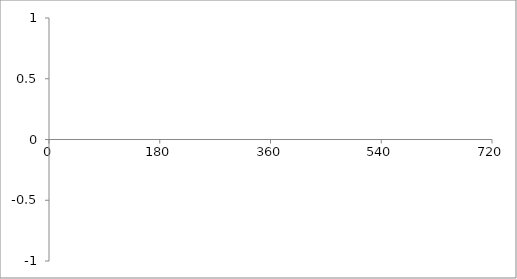
| Category | Series 0 |
|---|---|
| 0.0 | 0 |
| 0.0 | 0 |
| 0.0 | 0 |
| 0.0 | 0 |
| 0.0 | 0 |
| 0.0 | 0 |
| 0.0 | 0 |
| 0.0 | 0 |
| 0.0 | 0 |
| 0.0 | 0 |
| 0.0 | 0 |
| 0.0 | 0 |
| 0.0 | 0 |
| 0.0 | 0 |
| 0.0 | 0 |
| 0.0 | 0 |
| 0.0 | 0 |
| 0.0 | 0 |
| 0.0 | 0 |
| 0.0 | 0 |
| 0.0 | 0 |
| 0.0 | 0 |
| 0.0 | 0 |
| 0.0 | 0 |
| 0.0 | 0 |
| 0.0 | 0 |
| 0.0 | 0 |
| 0.0 | 0 |
| 0.0 | 0 |
| 0.0 | 0 |
| 0.0 | 0 |
| 0.0 | 0 |
| 0.0 | 0 |
| 0.0 | 0 |
| 0.0 | 0 |
| 0.0 | 0 |
| 0.0 | 0 |
| 0.0 | 0 |
| 0.0 | 0 |
| 0.0 | 0 |
| 0.0 | 0 |
| 0.0 | 0 |
| 0.0 | 0 |
| 0.0 | 0 |
| 0.0 | 0 |
| 0.0 | 0 |
| 0.0 | 0 |
| 0.0 | 0 |
| 0.0 | 0 |
| 0.0 | 0 |
| 0.0 | 0 |
| 0.0 | 0 |
| 0.0 | 0 |
| 0.0 | 0 |
| 0.0 | 0 |
| 0.0 | 0 |
| 0.0 | 0 |
| 0.0 | 0 |
| 0.0 | 0 |
| 0.0 | 0 |
| 0.0 | 0 |
| 0.0 | 0 |
| 0.0 | 0 |
| 0.0 | 0 |
| 0.0 | 0 |
| 0.0 | 0 |
| 0.0 | 0 |
| 0.0 | 0 |
| 0.0 | 0 |
| 0.0 | 0 |
| 0.0 | 0 |
| 0.0 | 0 |
| 0.0 | 0 |
| 0.0 | 0 |
| 0.0 | 0 |
| 0.0 | 0 |
| 0.0 | 0 |
| 0.0 | 0 |
| 0.0 | 0 |
| 0.0 | 0 |
| 0.0 | 0 |
| 0.0 | 0 |
| 0.0 | 0 |
| 0.0 | 0 |
| 0.0 | 0 |
| 0.0 | 0 |
| 0.0 | 0 |
| 0.0 | 0 |
| 0.0 | 0 |
| 0.0 | 0 |
| 0.0 | 0 |
| 0.0 | 0 |
| 0.0 | 0 |
| 0.0 | 0 |
| 0.0 | 0 |
| 0.0 | 0 |
| 0.0 | 0 |
| 0.0 | 0 |
| 0.0 | 0 |
| 0.0 | 0 |
| 0.0 | 0 |
| 0.0 | 0 |
| 0.0 | 0 |
| 0.0 | 0 |
| 0.0 | 0 |
| 0.0 | 0 |
| 0.0 | 0 |
| 0.0 | 0 |
| 0.0 | 0 |
| 0.0 | 0 |
| 0.0 | 0 |
| 0.0 | 0 |
| 0.0 | 0 |
| 0.0 | 0 |
| 0.0 | 0 |
| 0.0 | 0 |
| 0.0 | 0 |
| 0.0 | 0 |
| 0.0 | 0 |
| 0.0 | 0 |
| 0.0 | 0 |
| 0.0 | 0 |
| 0.0 | 0 |
| 0.0 | 0 |
| 0.0 | 0 |
| 0.0 | 0 |
| 0.0 | 0 |
| 0.0 | 0 |
| 0.0 | 0 |
| 0.0 | 0 |
| 0.0 | 0 |
| 0.0 | 0 |
| 0.0 | 0 |
| 0.0 | 0 |
| 0.0 | 0 |
| 0.0 | 0 |
| 0.0 | 0 |
| 0.0 | 0 |
| 0.0 | 0 |
| 0.0 | 0 |
| 0.0 | 0 |
| 0.0 | 0 |
| 0.0 | 0 |
| 0.0 | 0 |
| 0.0 | 0 |
| 0.0 | 0 |
| 0.0 | 0 |
| 0.0 | 0 |
| 0.0 | 0 |
| 0.0 | 0 |
| 0.0 | 0 |
| 0.0 | 0 |
| 0.0 | 0 |
| 0.0 | 0 |
| 0.0 | 0 |
| 0.0 | 0 |
| 0.0 | 0 |
| 0.0 | 0 |
| 0.0 | 0 |
| 0.0 | 0 |
| 0.0 | 0 |
| 0.0 | 0 |
| 0.0 | 0 |
| 0.0 | 0 |
| 0.0 | 0 |
| 0.0 | 0 |
| 0.0 | 0 |
| 0.0 | 0 |
| 0.0 | 0 |
| 0.0 | 0 |
| 0.0 | 0 |
| 0.0 | 0 |
| 0.0 | 0 |
| 0.0 | 0 |
| 0.0 | 0 |
| 0.0 | 0 |
| 0.0 | 0 |
| 0.0 | 0 |
| 0.0 | 0 |
| 0.0 | 0 |
| 0.0 | 0 |
| 0.0 | 0 |
| 0.0 | 0 |
| 0.0 | 0 |
| 0.0 | 0 |
| 0.0 | 0 |
| 0.0 | 0 |
| 0.0 | 0 |
| 0.0 | 0 |
| 0.0 | 0 |
| 0.0 | 0 |
| 0.0 | 0 |
| 0.0 | 0 |
| 0.0 | 0 |
| 0.0 | 0 |
| 0.0 | 0 |
| 0.0 | 0 |
| 0.0 | 0 |
| 0.0 | 0 |
| 0.0 | 0 |
| 0.0 | 0 |
| 0.0 | 0 |
| 0.0 | 0 |
| 0.0 | 0 |
| 0.0 | 0 |
| 0.0 | 0 |
| 0.0 | 0 |
| 0.0 | 0 |
| 0.0 | 0 |
| 0.0 | 0 |
| 0.0 | 0 |
| 0.0 | 0 |
| 0.0 | 0 |
| 0.0 | 0 |
| 0.0 | 0 |
| 0.0 | 0 |
| 0.0 | 0 |
| 0.0 | 0 |
| 0.0 | 0 |
| 0.0 | 0 |
| 0.0 | 0 |
| 0.0 | 0 |
| 0.0 | 0 |
| 0.0 | 0 |
| 0.0 | 0 |
| 0.0 | 0 |
| 0.0 | 0 |
| 0.0 | 0 |
| 0.0 | 0 |
| 0.0 | 0 |
| 0.0 | 0 |
| 0.0 | 0 |
| 0.0 | 0 |
| 0.0 | 0 |
| 0.0 | 0 |
| 0.0 | 0 |
| 0.0 | 0 |
| 0.0 | 0 |
| 0.0 | 0 |
| 0.0 | 0 |
| 0.0 | 0 |
| 0.0 | 0 |
| 0.0 | 0 |
| 0.0 | 0 |
| 0.0 | 0 |
| 0.0 | 0 |
| 0.0 | 0 |
| 0.0 | 0 |
| 0.0 | 0 |
| 0.0 | 0 |
| 0.0 | 0 |
| 0.0 | 0 |
| 0.0 | 0 |
| 0.0 | 0 |
| 0.0 | 0 |
| 0.0 | 0 |
| 0.0 | 0 |
| 0.0 | 0 |
| 0.0 | 0 |
| 0.0 | 0 |
| 0.0 | 0 |
| 0.0 | 0 |
| 0.0 | 0 |
| 0.0 | 0 |
| 0.0 | 0 |
| 0.0 | 0 |
| 0.0 | 0 |
| 0.0 | 0 |
| 0.0 | 0 |
| 0.0 | 0 |
| 0.0 | 0 |
| 0.0 | 0 |
| 0.0 | 0 |
| 0.0 | 0 |
| 0.0 | 0 |
| 0.0 | 0 |
| 0.0 | 0 |
| 0.0 | 0 |
| 0.0 | 0 |
| 0.0 | 0 |
| 0.0 | 0 |
| 0.0 | 0 |
| 0.0 | 0 |
| 0.0 | 0 |
| 0.0 | 0 |
| 0.0 | 0 |
| 0.0 | 0 |
| 0.0 | 0 |
| 0.0 | 0 |
| 0.0 | 0 |
| 0.0 | 0 |
| 0.0 | 0 |
| 0.0 | 0 |
| 0.0 | 0 |
| 0.0 | 0 |
| 0.0 | 0 |
| 0.0 | 0 |
| 0.0 | 0 |
| 0.0 | 0 |
| 0.0 | 0 |
| 0.0 | 0 |
| 0.0 | 0 |
| 0.0 | 0 |
| 0.0 | 0 |
| 0.0 | 0 |
| 0.0 | 0 |
| 0.0 | 0 |
| 0.0 | 0 |
| 0.0 | 0 |
| 0.0 | 0 |
| 0.0 | 0 |
| 0.0 | 0 |
| 0.0 | 0 |
| 0.0 | 0 |
| 0.0 | 0 |
| 0.0 | 0 |
| 0.0 | 0 |
| 0.0 | 0 |
| 0.0 | 0 |
| 0.0 | 0 |
| 0.0 | 0 |
| 0.0 | 0 |
| 0.0 | 0 |
| 0.0 | 0 |
| 0.0 | 0 |
| 0.0 | 0 |
| 0.0 | 0 |
| 0.0 | 0 |
| 0.0 | 0 |
| 0.0 | 0 |
| 0.0 | 0 |
| 0.0 | 0 |
| 0.0 | 0 |
| 0.0 | 0 |
| 0.0 | 0 |
| 0.0 | 0 |
| 0.0 | 0 |
| 0.0 | 0 |
| 0.0 | 0 |
| 0.0 | 0 |
| 0.0 | 0 |
| 0.0 | 0 |
| 0.0 | 0 |
| 0.0 | 0 |
| 0.0 | 0 |
| 0.0 | 0 |
| 0.0 | 0 |
| 0.0 | 0 |
| 0.0 | 0 |
| 0.0 | 0 |
| 0.0 | 0 |
| 0.0 | 0 |
| 0.0 | 0 |
| 0.0 | 0 |
| 0.0 | 0 |
| 0.0 | 0 |
| 0.0 | 0 |
| 0.0 | 0 |
| 0.0 | 0 |
| 0.0 | 0 |
| 0.0 | 0 |